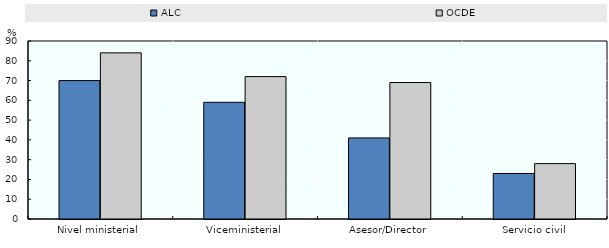
| Category | ALC | OCDE |
|---|---|---|
| Nivel ministerial | 70 | 84 |
| Viceministerial | 59 | 72 |
| Asesor/Director | 41 | 69 |
| Servicio civil | 23 | 28 |